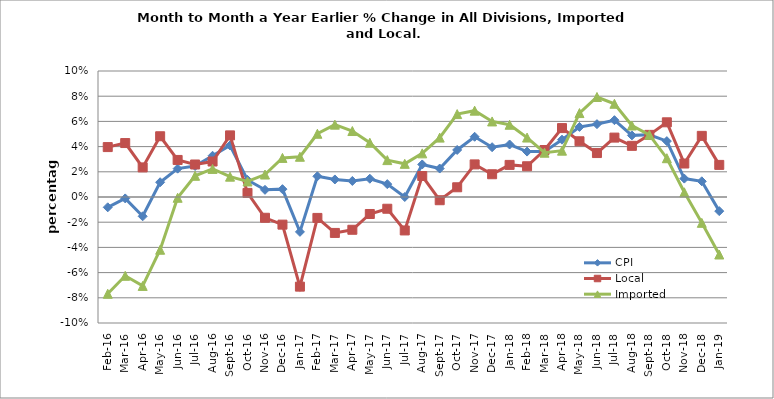
| Category | CPI | Local | Imported |
|---|---|---|---|
| 2016-02-01 | -0.008 | 0.04 | -0.077 |
| 2016-03-01 | -0.001 | 0.043 | -0.063 |
| 2016-04-01 | -0.015 | 0.023 | -0.071 |
| 2016-05-01 | 0.012 | 0.048 | -0.042 |
| 2016-06-01 | 0.023 | 0.029 | -0.001 |
| 2016-07-01 | 0.025 | 0.026 | 0.017 |
| 2016-08-01 | 0.033 | 0.028 | 0.022 |
| 2016-09-01 | 0.041 | 0.049 | 0.016 |
| 2016-10-01 | 0.014 | 0.003 | 0.012 |
| 2016-11-01 | 0.006 | -0.016 | 0.018 |
| 2016-12-01 | 0.006 | -0.022 | 0.031 |
| 2017-01-01 | -0.028 | -0.071 | 0.032 |
| 2017-02-01 | 0.016 | -0.017 | 0.05 |
| 2017-03-01 | 0.014 | -0.029 | 0.057 |
| 2017-04-01 | 0.013 | -0.026 | 0.052 |
| 2017-05-01 | 0.015 | -0.013 | 0.043 |
| 2017-06-01 | 0.01 | -0.009 | 0.029 |
| 2017-07-01 | 0 | -0.027 | 0.026 |
| 2017-08-01 | 0.026 | 0.017 | 0.035 |
| 2017-09-01 | 0.023 | -0.003 | 0.047 |
| 2017-10-01 | 0.037 | 0.008 | 0.066 |
| 2017-11-01 | 0.048 | 0.026 | 0.069 |
| 2017-12-01 | 0.04 | 0.018 | 0.06 |
| 2018-01-01 | 0.042 | 0.025 | 0.057 |
| 2018-02-01 | 0.036 | 0.024 | 0.047 |
| 2018-03-01 | 0.036 | 0.037 | 0.035 |
| 2018-04-01 | 0.045 | 0.055 | 0.037 |
| 2018-05-01 | 0.056 | 0.044 | 0.067 |
| 2018-06-01 | 0.058 | 0.035 | 0.079 |
| 2018-07-01 | 0.061 | 0.047 | 0.074 |
| 2018-08-01 | 0.049 | 0.041 | 0.057 |
| 2018-09-01 | 0.049 | 0.049 | 0.049 |
| 2018-10-01 | 0.044 | 0.059 | 0.031 |
| 2018-11-01 | 0.015 | 0.027 | 0.004 |
| 2018-12-01 | 0.012 | 0.049 | -0.021 |
| 2019-01-01 | -0.011 | 0.025 | -0.046 |